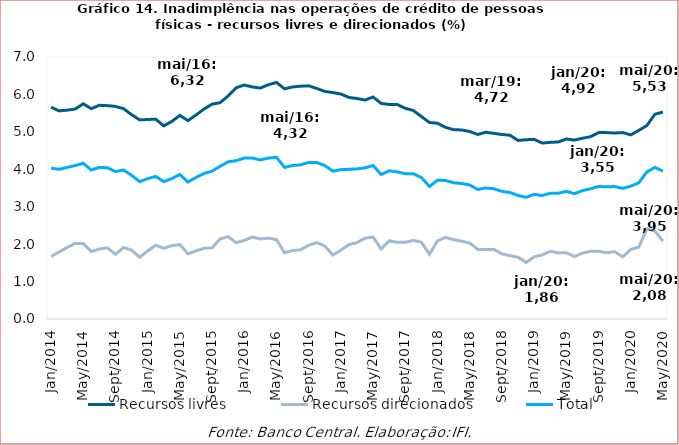
| Category | Recursos livres | Recursos direcionados | Total |
|---|---|---|---|
| 2014-01-01 | 5.66 | 1.67 | 4.03 |
| 2014-02-01 | 5.56 | 1.79 | 4 |
| 2014-03-01 | 5.58 | 1.91 | 4.05 |
| 2014-04-01 | 5.61 | 2.02 | 4.1 |
| 2014-05-01 | 5.75 | 2.02 | 4.16 |
| 2014-06-01 | 5.62 | 1.8 | 3.98 |
| 2014-07-01 | 5.71 | 1.87 | 4.05 |
| 2014-08-01 | 5.7 | 1.9 | 4.04 |
| 2014-09-01 | 5.68 | 1.73 | 3.94 |
| 2014-10-01 | 5.62 | 1.91 | 3.98 |
| 2014-11-01 | 5.46 | 1.84 | 3.84 |
| 2014-12-01 | 5.32 | 1.65 | 3.67 |
| 2015-01-01 | 5.33 | 1.82 | 3.75 |
| 2015-02-01 | 5.34 | 1.97 | 3.81 |
| 2015-03-01 | 5.16 | 1.89 | 3.67 |
| 2015-04-01 | 5.28 | 1.96 | 3.75 |
| 2015-05-01 | 5.44 | 1.99 | 3.86 |
| 2015-06-01 | 5.3 | 1.74 | 3.66 |
| 2015-07-01 | 5.45 | 1.82 | 3.78 |
| 2015-08-01 | 5.61 | 1.89 | 3.89 |
| 2015-09-01 | 5.74 | 1.9 | 3.95 |
| 2015-10-01 | 5.78 | 2.14 | 4.08 |
| 2015-11-01 | 5.96 | 2.2 | 4.2 |
| 2015-12-01 | 6.18 | 2.04 | 4.23 |
| 2016-01-01 | 6.25 | 2.1 | 4.3 |
| 2016-02-01 | 6.2 | 2.19 | 4.3 |
| 2016-03-01 | 6.17 | 2.14 | 4.25 |
| 2016-04-01 | 6.26 | 2.16 | 4.3 |
| 2016-05-01 | 6.32 | 2.12 | 4.32 |
| 2016-06-01 | 6.15 | 1.77 | 4.05 |
| 2016-07-01 | 6.2 | 1.83 | 4.1 |
| 2016-08-01 | 6.22 | 1.85 | 4.12 |
| 2016-09-01 | 6.23 | 1.97 | 4.18 |
| 2016-10-01 | 6.16 | 2.04 | 4.18 |
| 2016-11-01 | 6.08 | 1.95 | 4.1 |
| 2016-12-01 | 6.05 | 1.71 | 3.95 |
| 2017-01-01 | 6.01 | 1.84 | 3.99 |
| 2017-02-01 | 5.92 | 1.99 | 4 |
| 2017-03-01 | 5.89 | 2.04 | 4.01 |
| 2017-04-01 | 5.85 | 2.16 | 4.04 |
| 2017-05-01 | 5.93 | 2.19 | 4.1 |
| 2017-06-01 | 5.76 | 1.87 | 3.86 |
| 2017-07-01 | 5.73 | 2.09 | 3.96 |
| 2017-08-01 | 5.73 | 2.05 | 3.93 |
| 2017-09-01 | 5.63 | 2.05 | 3.88 |
| 2017-10-01 | 5.57 | 2.1 | 3.88 |
| 2017-11-01 | 5.41 | 2.05 | 3.78 |
| 2017-12-01 | 5.25 | 1.73 | 3.54 |
| 2018-01-01 | 5.23 | 2.09 | 3.71 |
| 2018-02-01 | 5.12 | 2.18 | 3.7 |
| 2018-03-01 | 5.06 | 2.12 | 3.64 |
| 2018-04-01 | 5.05 | 2.08 | 3.62 |
| 2018-05-01 | 5.01 | 2.03 | 3.58 |
| 2018-06-01 | 4.93 | 1.86 | 3.46 |
| 2018-07-01 | 4.99 | 1.86 | 3.5 |
| 2018-08-01 | 4.96 | 1.86 | 3.48 |
| 2018-09-01 | 4.93 | 1.74 | 3.41 |
| 2018-10-01 | 4.91 | 1.69 | 3.38 |
| 2018-11-01 | 4.77 | 1.65 | 3.3 |
| 2018-12-01 | 4.79 | 1.51 | 3.25 |
| 2019-01-01 | 4.8 | 1.66 | 3.33 |
| 2019-02-01 | 4.7 | 1.71 | 3.3 |
| 2019-03-01 | 4.72 | 1.81 | 3.36 |
| 2019-04-01 | 4.73 | 1.77 | 3.36 |
| 2019-05-01 | 4.81 | 1.77 | 3.41 |
| 2019-06-01 | 4.78 | 1.67 | 3.35 |
| 2019-07-01 | 4.83 | 1.76 | 3.43 |
| 2019-08-01 | 4.87 | 1.81 | 3.48 |
| 2019-09-01 | 4.98 | 1.81 | 3.54 |
| 2019-10-01 | 4.98 | 1.77 | 3.53 |
| 2019-11-01 | 4.97 | 1.8 | 3.54 |
| 2019-12-01 | 4.98 | 1.66 | 3.49 |
| 2020-01-01 | 4.92 | 1.86 | 3.55 |
| 2020-02-01 | 5.04 | 1.92 | 3.64 |
| 2020-03-01 | 5.17 | 2.41 | 3.93 |
| 2020-04-01 | 5.47 | 2.35 | 4.05 |
| 2020-05-01 | 5.53 | 2.08 | 3.95 |